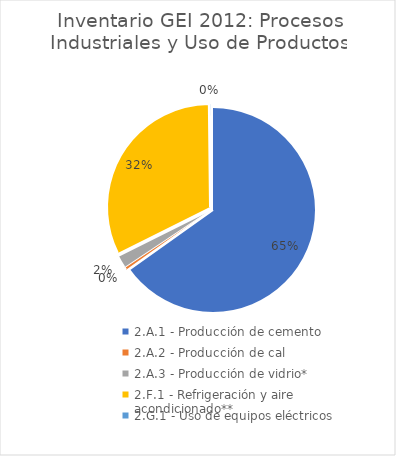
| Category | Series 0 |
|---|---|
| 2.A.1 - Producción de cemento | 639.09 |
| 2.A.2 - Producción de cal | 4.58 |
| 2.A.3 - Producción de vidrio* | 19.6 |
| 2.F.1 - Refrigeración y aire acondicionado** | 315.67 |
| 2.G.1 - Uso de equipos eléctricos | 1.75 |